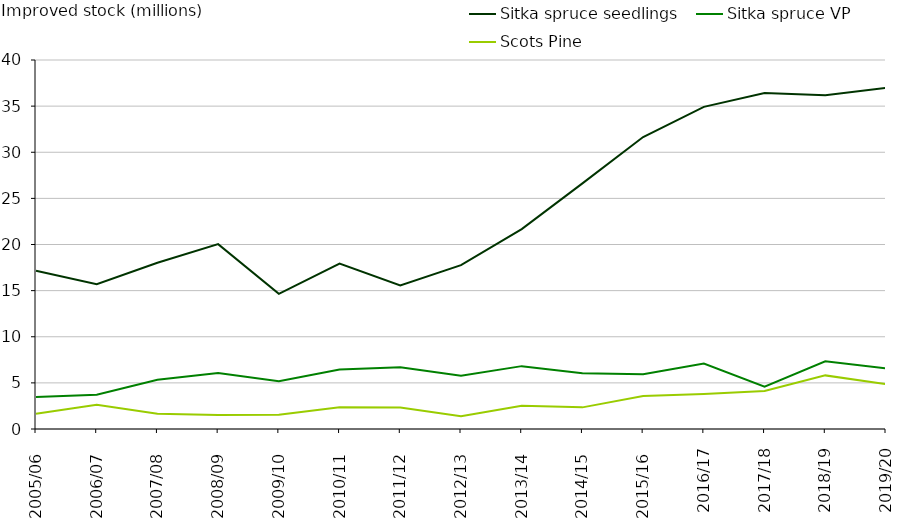
| Category | Sitka spruce seedlings | Sitka spruce VP | Scots Pine |
|---|---|---|---|
| 2005/06  | 17.152 | 3.459 | 1.664 |
| 2006/07  | 15.691 | 3.71 | 2.616 |
| 2007/08  | 18.015 | 5.34 | 1.665 |
| 2008/09  | 20.037 | 6.065 | 1.523 |
| 2009/10  | 14.651 | 5.17 | 1.543 |
| 2010/11  | 17.926 | 6.454 | 2.35 |
| 2011/12  | 15.549 | 6.699 | 2.32 |
| 2012/13  | 17.758 | 5.786 | 1.379 |
| 2013/14  | 21.674 | 6.814 | 2.526 |
| 2014/15  | 26.629 | 6.049 | 2.345 |
| 2015/16  | 31.65 | 5.931 | 3.575 |
| 2016/17 | 34.924 | 7.1 | 3.783 |
| 2017/18 | 36.426 | 4.6 | 4.119 |
| 2018/19 | 36.168 | 7.336 | 5.812 |
| 2019/20 | 36.979 | 6.582 | 4.856 |